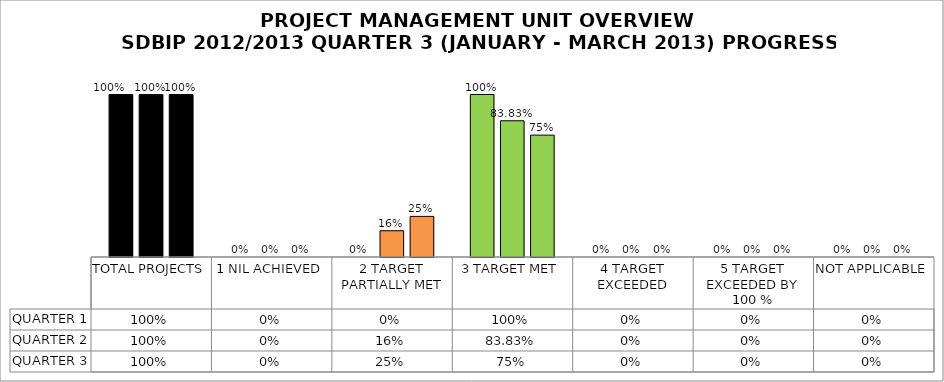
| Category | QUARTER 1 | QUARTER 2 | QUARTER 3 |
|---|---|---|---|
| TOTAL PROJECTS | 1 | 1 | 1 |
| 1 NIL ACHIEVED | 0 | 0 | 0 |
| 2 TARGET PARTIALLY MET | 0 | 0.162 | 0.25 |
| 3 TARGET MET | 1 | 0.838 | 0.75 |
| 4 TARGET EXCEEDED | 0 | 0 | 0 |
| 5 TARGET EXCEEDED BY 100 % | 0 | 0 | 0 |
| NOT APPLICABLE | 0 | 0 | 0 |